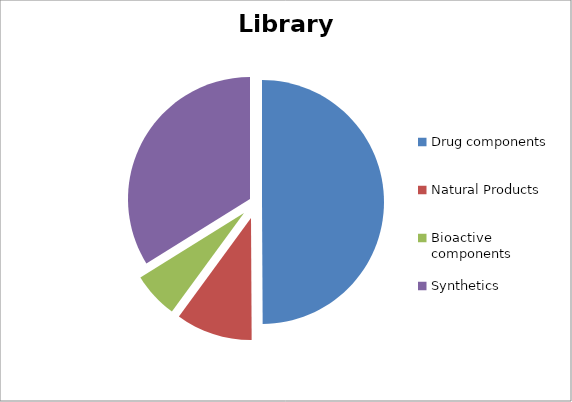
| Category | Library composition |
|---|---|
| Drug components | 0.499 |
| Natural Products | 0.101 |
| Bioactive components | 0.061 |
| Synthetics | 0.339 |